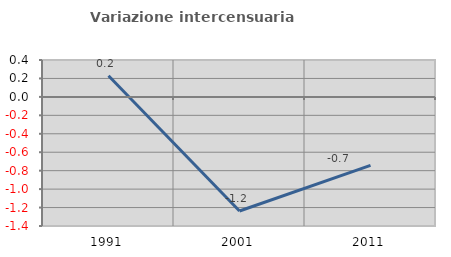
| Category | Variazione intercensuaria annua |
|---|---|
| 1991.0 | 0.23 |
| 2001.0 | -1.237 |
| 2011.0 | -0.742 |